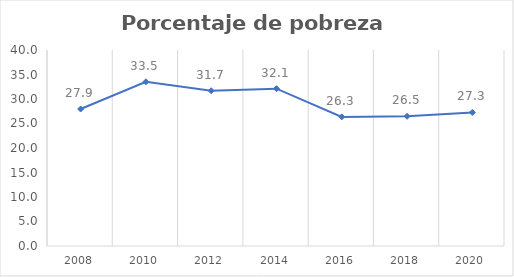
| Category | 27.9 |
|---|---|
| 2008.0 | 27.95 |
| 2010.0 | 33.506 |
| 2012.0 | 31.69 |
| 2014.0 | 32.116 |
| 2016.0 | 26.35 |
| 2018.0 | 26.47 |
| 2020.0 | 27.26 |